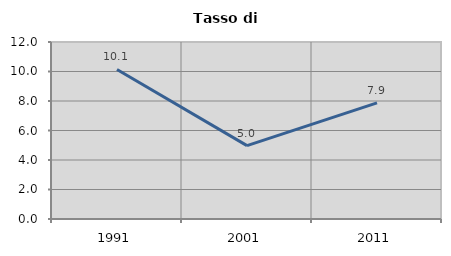
| Category | Tasso di disoccupazione   |
|---|---|
| 1991.0 | 10.141 |
| 2001.0 | 4.975 |
| 2011.0 | 7.876 |